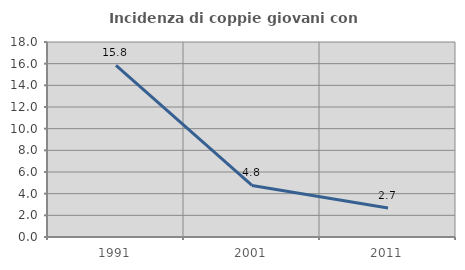
| Category | Incidenza di coppie giovani con figli |
|---|---|
| 1991.0 | 15.847 |
| 2001.0 | 4.762 |
| 2011.0 | 2.685 |